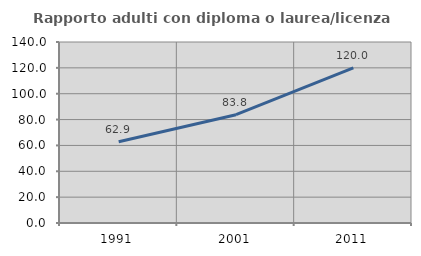
| Category | Rapporto adulti con diploma o laurea/licenza media  |
|---|---|
| 1991.0 | 62.857 |
| 2001.0 | 83.784 |
| 2011.0 | 120 |